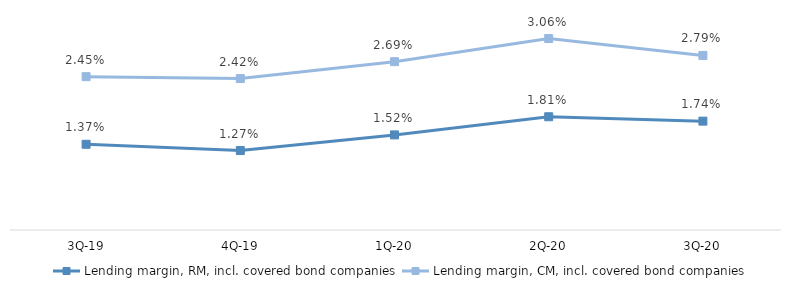
| Category | Lending margin, RM, incl. covered bond companies | Lending margin, CM, incl. covered bond companies |
|---|---|---|
| 3Q-20 | 0.017 | 0.028 |
| 2Q-20 | 0.018 | 0.031 |
| 1Q-20 | 0.015 | 0.027 |
| 4Q-19 | 0.013 | 0.024 |
| 3Q-19 | 0.014 | 0.024 |